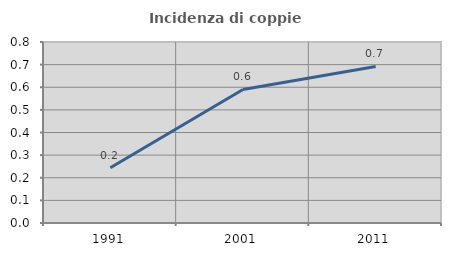
| Category | Incidenza di coppie miste |
|---|---|
| 1991.0 | 0.244 |
| 2001.0 | 0.59 |
| 2011.0 | 0.692 |